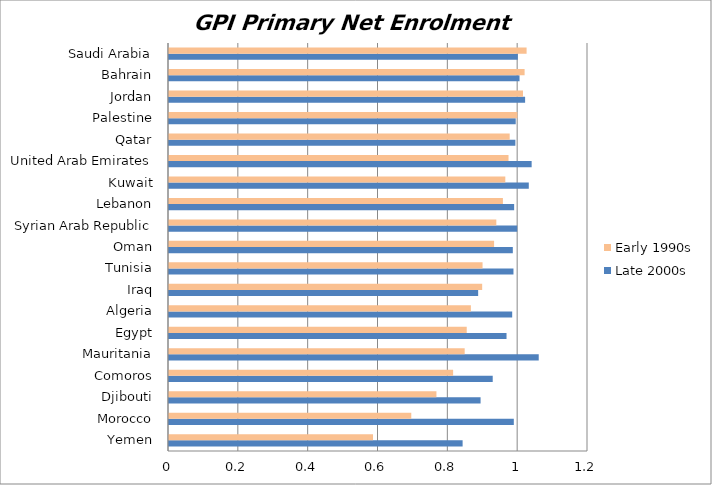
| Category | Late 2000s | Early 1990s |
|---|---|---|
| Yemen | 0.841 | 0.584 |
| Morocco | 0.988 | 0.694 |
| Djibouti | 0.892 | 0.766 |
| Comoros | 0.927 | 0.814 |
| Mauritania | 1.059 | 0.847 |
| Egypt | 0.967 | 0.853 |
| Algeria | 0.983 | 0.865 |
| Iraq | 0.885 | 0.897 |
| Tunisia | 0.987 | 0.898 |
| Oman | 0.985 | 0.931 |
| Syrian Arab Republic | 0.997 | 0.937 |
| Lebanon | 0.988 | 0.956 |
| Kuwait | 1.03 | 0.963 |
| United Arab Emirates | 1.039 | 0.972 |
| Qatar | 0.992 | 0.976 |
| Palestine | 0.993 | 0.998 |
| Jordan | 1.02 | 1.014 |
| Bahrain | 1.004 | 1.018 |
| Saudi Arabia | 0.999 | 1.024 |